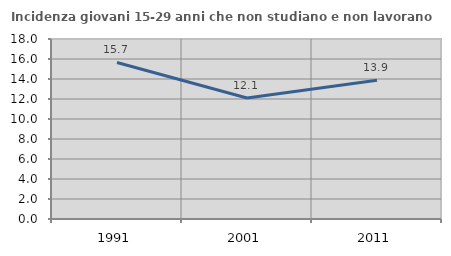
| Category | Incidenza giovani 15-29 anni che non studiano e non lavorano  |
|---|---|
| 1991.0 | 15.657 |
| 2001.0 | 12.099 |
| 2011.0 | 13.88 |